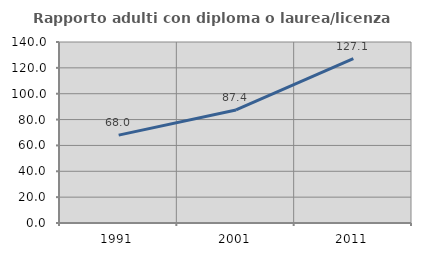
| Category | Rapporto adulti con diploma o laurea/licenza media  |
|---|---|
| 1991.0 | 67.97 |
| 2001.0 | 87.407 |
| 2011.0 | 127.077 |